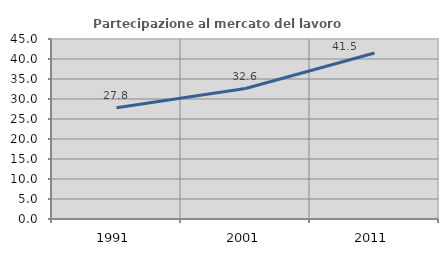
| Category | Partecipazione al mercato del lavoro  femminile |
|---|---|
| 1991.0 | 27.807 |
| 2001.0 | 32.616 |
| 2011.0 | 41.489 |